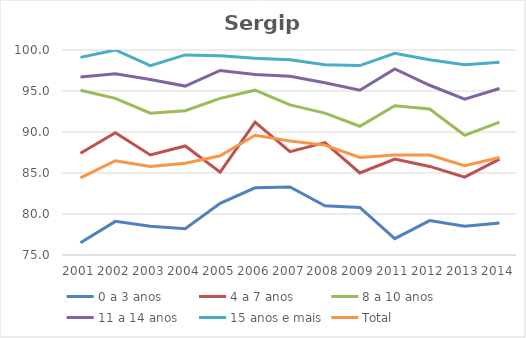
| Category | 0 a 3 anos | 4 a 7 anos | 8 a 10 anos | 11 a 14 anos | 15 anos e mais | Total |
|---|---|---|---|---|---|---|
| 2001.0 | 76.5 | 87.4 | 95.1 | 96.7 | 99.1 | 84.4 |
| 2002.0 | 79.1 | 89.9 | 94.1 | 97.1 | 100 | 86.5 |
| 2003.0 | 78.5 | 87.2 | 92.3 | 96.4 | 98.1 | 85.8 |
| 2004.0 | 78.2 | 88.3 | 92.6 | 95.6 | 99.4 | 86.2 |
| 2005.0 | 81.3 | 85.1 | 94.1 | 97.5 | 99.3 | 87.1 |
| 2006.0 | 83.2 | 91.2 | 95.1 | 97 | 99 | 89.6 |
| 2007.0 | 83.3 | 87.6 | 93.3 | 96.8 | 98.8 | 88.9 |
| 2008.0 | 81 | 88.7 | 92.3 | 96 | 98.2 | 88.4 |
| 2009.0 | 80.8 | 85 | 90.7 | 95.1 | 98.1 | 86.9 |
| 2011.0 | 77 | 86.7 | 93.2 | 97.7 | 99.6 | 87.2 |
| 2012.0 | 79.2 | 85.8 | 92.8 | 95.7 | 98.8 | 87.2 |
| 2013.0 | 78.5 | 84.5 | 89.6 | 94 | 98.2 | 85.9 |
| 2014.0 | 78.9 | 86.7 | 91.2 | 95.3 | 98.5 | 86.9 |